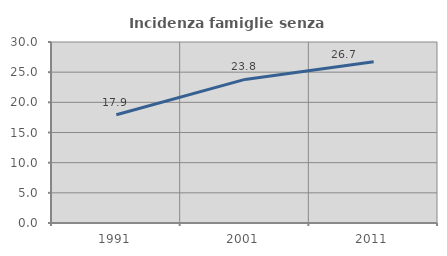
| Category | Incidenza famiglie senza nuclei |
|---|---|
| 1991.0 | 17.939 |
| 2001.0 | 23.802 |
| 2011.0 | 26.734 |